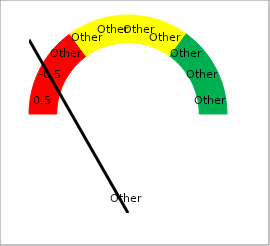
| Category | Series 0 |
|---|---|
| 0 | 0 |
|  | 1 |
|  | 0 |
|  | 1 |
|  | 0 |
|  | 1 |
| 1.5 | 0 |
|  | 1 |
|  | 0 |
|  | 1 |
| 2.5 | 0 |
|  | 1 |
|  | 0 |
|  | 1 |
| 3.5 | 0 |
|  | 1 |
|  | 0 |
|  | 1 |
|  | 0 |
|  | 1 |
| 5 | 0 |